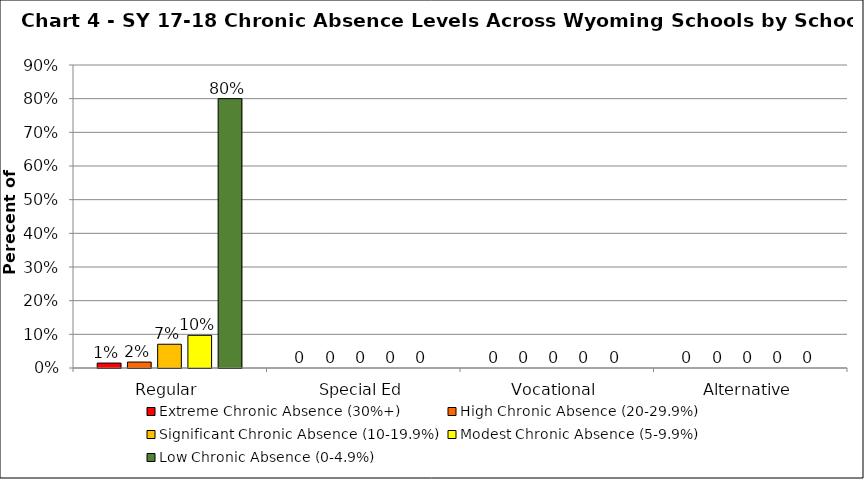
| Category | Extreme Chronic Absence (30%+) | High Chronic Absence (20-29.9%) | Significant Chronic Absence (10-19.9%) | Modest Chronic Absence (5-9.9%) | Low Chronic Absence (0-4.9%) |
|---|---|---|---|---|---|
| 0 | 0.015 | 0.018 | 0.071 | 0.097 | 0.8 |
| 1 | 0 | 0 | 0 | 0 | 0 |
| 2 | 0 | 0 | 0 | 0 | 0 |
| 3 | 0 | 0 | 0 | 0 | 0 |